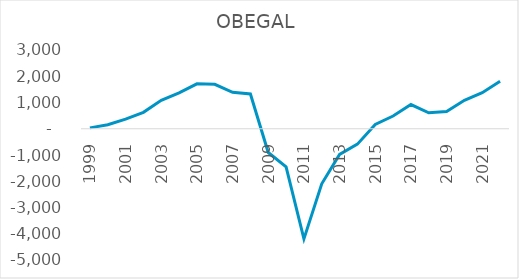
| Category | OBEGAL |
|---|---|
| 1999-06-01 | 33.376 |
| 2000-06-01 | 153.869 |
| 2001-06-01 | 366.327 |
| 2002-06-01 | 625.862 |
| 2003-06-01 | 1084.104 |
| 2004-06-01 | 1363.454 |
| 2005-06-01 | 1711.217 |
| 2006-06-01 | 1694.535 |
| 2007-06-01 | 1387.357 |
| 2008-06-01 | 1323.317 |
| 2009-06-01 | -904.804 |
| 2010-06-01 | -1451.501 |
| 2011-06-01 | -4196.197 |
| 2012-06-01 | -2096.198 |
| 2013-06-01 | -979.717 |
| 2014-06-01 | -586.071 |
| 2015-06-01 | 161.236 |
| 2016-06-01 | 485.617 |
| 2017-06-01 | 920.962 |
| 2018-06-01 | 606.658 |
| 2019-06-01 | 656.388 |
| 2020-06-01 | 1085.173 |
| 2021-06-01 | 1373.777 |
| 2022-06-01 | 1808.114 |